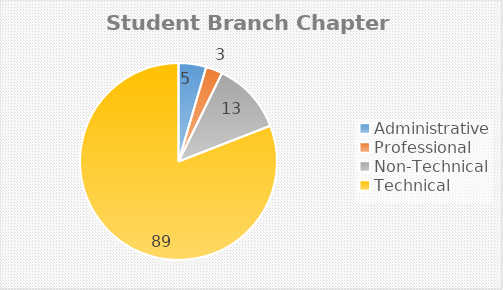
| Category | Series 0 |
|---|---|
| Administrative | 5 |
| Professional | 3 |
| Non-Technical | 13 |
| Technical | 89 |